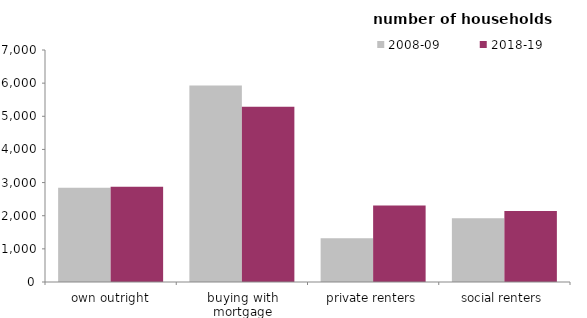
| Category | 2008-09 | 2018-19 |
|---|---|---|
| own outright | 2840.666 | 2877.219 |
| buying with mortgage | 5926.443 | 5287.333 |
| private renters | 1318.224 | 2308.049 |
| social renters | 1925.259 | 2144.431 |